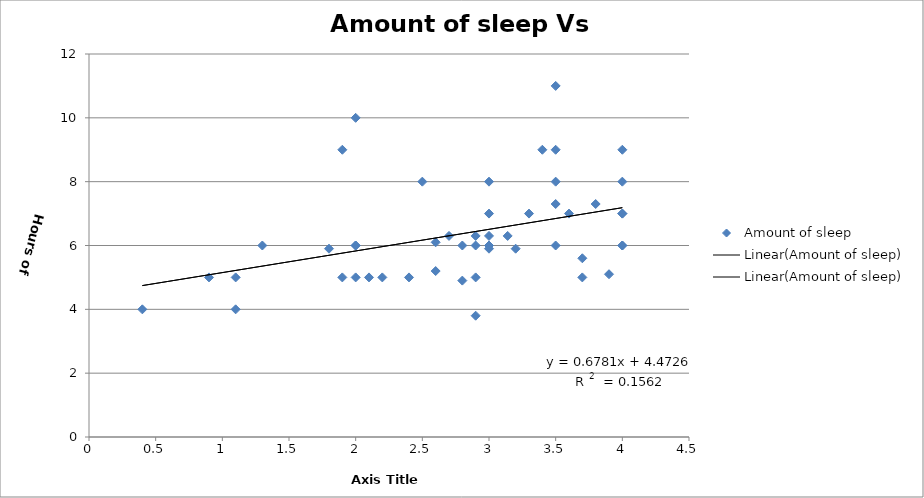
| Category | Amount of sleep |
|---|---|
| 2.4 | 5 |
| 3.2 | 5.9 |
| 2.7 | 6.3 |
| 2.9 | 5 |
| 3.5 | 7.3 |
| 4.0 | 9 |
| 3.14 | 6.3 |
| 2.9 | 3.8 |
| 3.9 | 5.1 |
| 2.6 | 5.2 |
| 2.1 | 5 |
| 3.0 | 6.3 |
| 3.8 | 7.3 |
| 2.9 | 6.3 |
| 2.6 | 6.1 |
| 4.0 | 8 |
| 3.6 | 7 |
| 3.0 | 5.9 |
| 2.8 | 4.9 |
| 3.5 | 11 |
| 2.0 | 10 |
| 3.7 | 5 |
| 3.5 | 8 |
| 3.7 | 5.6 |
| 1.8 | 5.9 |
| 2.0 | 6 |
| 3.0 | 6 |
| 3.5 | 6 |
| 3.0 | 8 |
| 1.9 | 5 |
| 4.0 | 7 |
| 1.1 | 4 |
| 2.0 | 5 |
| 2.5 | 8 |
| 3.0 | 7 |
| 2.2 | 5 |
| 2.0 | 6 |
| 4.0 | 6 |
| 1.1 | 5 |
| 1.3 | 6 |
| 3.4 | 9 |
| 2.8 | 6 |
| 2.9 | 6 |
| 4.0 | 7 |
| 3.5 | 9 |
| 0.4 | 4 |
| 0.9 | 5 |
| 1.9 | 9 |
| 3.3 | 7 |
| 4.0 | 6 |